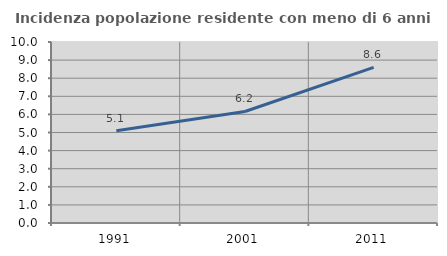
| Category | Incidenza popolazione residente con meno di 6 anni |
|---|---|
| 1991.0 | 5.095 |
| 2001.0 | 6.161 |
| 2011.0 | 8.602 |